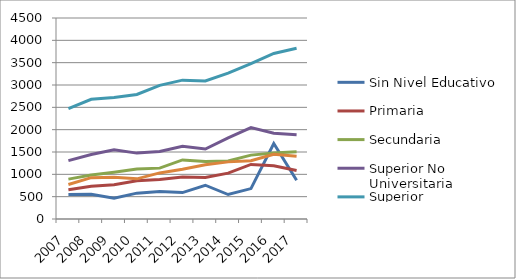
| Category | Sin Nivel Educativo | Primaria | Secundaria | Superior No Universitaria | Superior Universitaria | General |
|---|---|---|---|---|---|---|
| 2007.0 | 548 | 653 | 893 | 1308 | 2472 | 773 |
| 2008.0 | 556 | 733 | 984 | 1445 | 2681 | 925 |
| 2009.0 | 467 | 767 | 1047 | 1551 | 2720 | 932 |
| 2010.0 | 579 | 857 | 1120 | 1475 | 2787 | 899 |
| 2011.0 | 613 | 883 | 1139 | 1510 | 2993 | 1032 |
| 2012.0 | 591 | 939 | 1322 | 1628 | 3109 | 1112 |
| 2013.0 | 756 | 927 | 1285 | 1566 | 3092 | 1214 |
| 2014.0 | 548 | 1027 | 1298 | 1815 | 3265 | 1279 |
| 2015.0 | 681 | 1221 | 1430 | 2045 | 3476 | 1306 |
| 2016.0 | 1689 | 1194 | 1479 | 1920 | 3706 | 1450 |
| 2017.0 | 868 | 1086 | 1507 | 1885 | 3821 | 1403 |